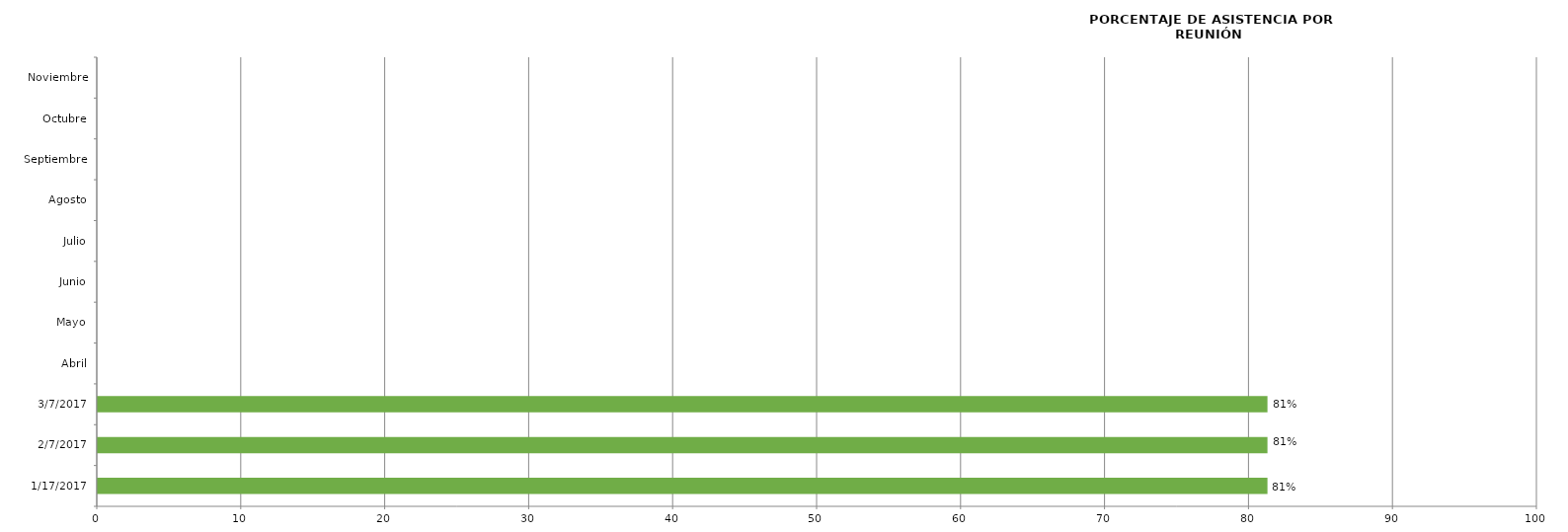
| Category | Series 0 |
|---|---|
| 17/01/2017 | 81.25 |
| 07/02/2017 | 81.25 |
| 07/03/2017 | 81.25 |
| Abril | 0 |
| Mayo | 0 |
| Junio | 0 |
| Julio | 0 |
| Agosto | 0 |
| Septiembre | 0 |
| Octubre | 0 |
| Noviembre | 0 |